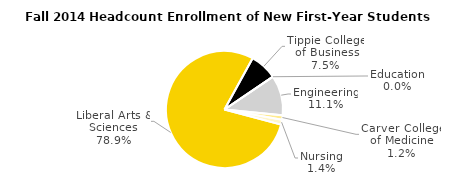
| Category | Series 0 |
|---|---|
| Liberal Arts & Sciences | 3668 |
| Tippie College of Business | 350 |
| Education | 1 |
| Engineering | 514 |
| Carver College of Medicine | 56 |
| Nursing | 64 |